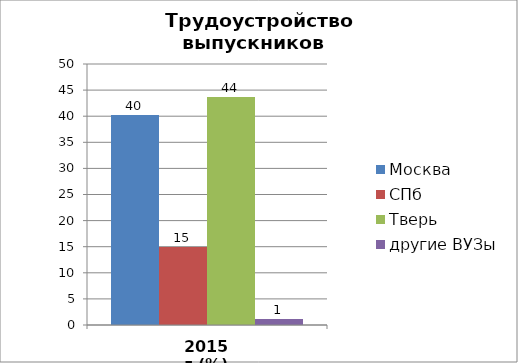
| Category | Москва | СПб | Тверь | другие ВУЗы |
|---|---|---|---|---|
| 2015 г.(%) | 40.23 | 14.943 | 43.678 | 1.149 |